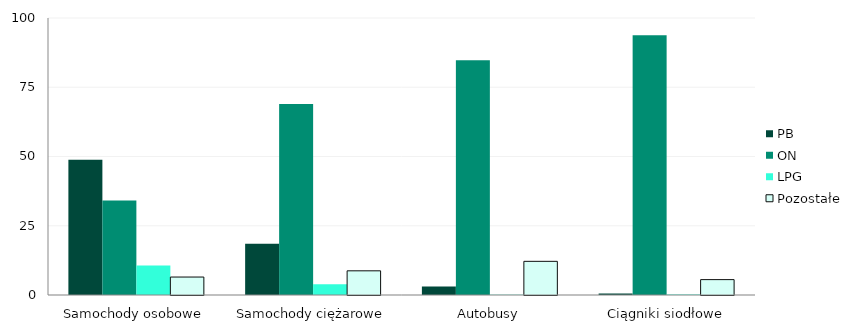
| Category | PB | ON | LPG | Pozostałe |
|---|---|---|---|---|
| 0 | 48.784 | 34.12 | 10.612 | 6.484 |
| 1 | 18.493 | 68.926 | 3.852 | 8.729 |
| 2 | 3.045 | 84.732 | 0.07 | 12.153 |
| 3 | 0.528 | 93.732 | 0.189 | 5.551 |